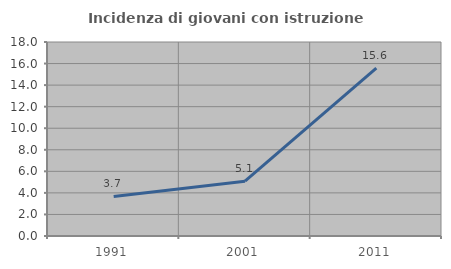
| Category | Incidenza di giovani con istruzione universitaria |
|---|---|
| 1991.0 | 3.668 |
| 2001.0 | 5.087 |
| 2011.0 | 15.576 |